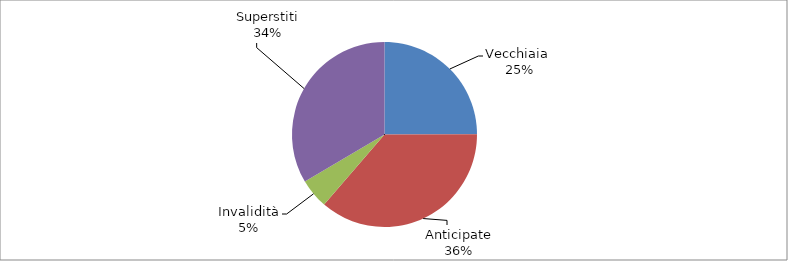
| Category | Series 0 |
|---|---|
| Vecchiaia  | 17411 |
| Anticipate | 25372 |
| Invalidità | 3625 |
| Superstiti | 23361 |